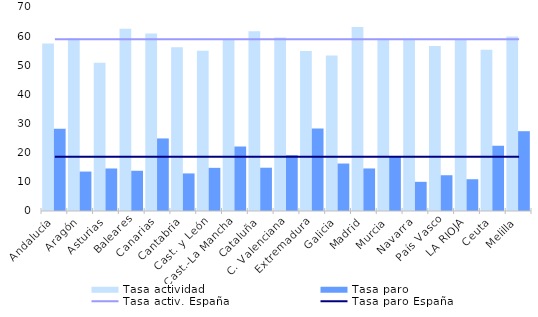
| Category | Tasa actividad | Tasa paro |
|---|---|---|
| Andalucía | 57.47 | 28.25 |
| Aragón | 59.2 | 13.53 |
| Asturias | 50.9 | 14.59 |
| Baleares | 62.5 | 13.8 |
| Canarias | 60.93 | 24.9 |
| Cantabria | 56.2 | 12.89 |
| Cast. y León | 54.98 | 14.81 |
| Cast.-La Mancha | 58.84 | 22.14 |
| Cataluña | 61.64 | 14.85 |
| C. Valenciana | 59.5 | 19.15 |
| Extremadura | 54.93 | 28.31 |
| Galicia | 53.37 | 16.29 |
| Madrid | 63.18 | 14.6 |
| Murcia | 59.08 | 18.58 |
| Navarra | 58.91 | 10.01 |
| País Vasco | 56.66 | 12.27 |
| LA RIOJA | 58.8 | 10.9 |
| Ceuta | 55.29 | 22.39 |
| Melilla | 59.85 | 27.38 |